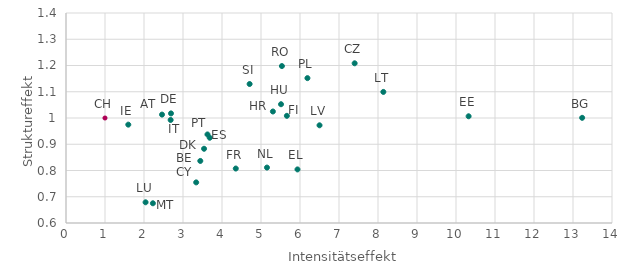
| Category | Struktureffekt |
|---|---|
| 2.4619855880737305 | 1.013 |
| 3.4437572956085205 | 0.836 |
| 13.234585762023926 | 1.001 |
| 3.337965488433838 | 0.755 |
| 7.401290416717529 | 1.208 |
| 2.691911458969116 | 1.017 |
| 3.5401158332824707 | 0.883 |
| 10.3233642578125 | 1.007 |
| 5.935638427734375 | 0.804 |
| 3.6858925819396973 | 0.925 |
| 5.663419723510742 | 1.008 |
| 4.35329532623291 | 0.807 |
| 5.305153846740723 | 1.025 |
| 5.5133957862854 | 1.052 |
| 1.597275972366333 | 0.975 |
| 2.6832261085510254 | 0.992 |
| 8.1371488571167 | 1.099 |
| 2.0403895378112793 | 0.679 |
| 6.500762939453125 | 0.972 |
| 2.2280397415161133 | 0.675 |
| 5.153104305267334 | 0.811 |
| 6.190605163574219 | 1.152 |
| 3.627408266067505 | 0.937 |
| 5.536040306091309 | 1.198 |
| 4.708096981048584 | 1.129 |
| 1.0 | 1 |